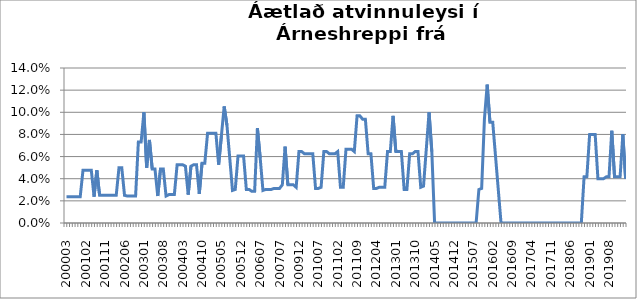
| Category | Series 0 |
|---|---|
| 200003 | 0.024 |
| 200004 | 0.024 |
| 200005 | 0.024 |
| 200010 | 0.024 |
| 200011 | 0.024 |
| 200012 | 0.024 |
| 200101 | 0.048 |
| 200102 | 0.048 |
| 200103 | 0.048 |
| 200104 | 0.048 |
| 200105 | 0.024 |
| 200106 | 0.048 |
| 200107 | 0.025 |
| 200108 | 0.025 |
| 200111 | 0.025 |
| 200112 | 0.025 |
| 200201 | 0.025 |
| 200202 | 0.025 |
| 200203 | 0.025 |
| 200204 | 0.05 |
| 200205 | 0.05 |
| 200206 | 0.025 |
| 200207 | 0.024 |
| 200208 | 0.024 |
| 200209 | 0.024 |
| 200210 | 0.024 |
| 200211 | 0.073 |
| 200212 | 0.073 |
| 200301 | 0.1 |
| 200302 | 0.05 |
| 200303 | 0.075 |
| 200304 | 0.049 |
| 200305 | 0.049 |
| 200306 | 0.024 |
| 200307 | 0.049 |
| 200308 | 0.049 |
| 200309 | 0.024 |
| 200310 | 0.026 |
| 200311 | 0.026 |
| 200312 | 0.026 |
| 200401 | 0.053 |
| 200402 | 0.053 |
| 200403 | 0.053 |
| 200404 | 0.051 |
| 200405 | 0.026 |
| 200406 | 0.051 |
| 200407 | 0.053 |
| 200408 | 0.053 |
| 200409 | 0.026 |
| 200410 | 0.054 |
| 200411 | 0.054 |
| 200412 | 0.081 |
| 200501 | 0.081 |
| 200502 | 0.081 |
| 200503 | 0.081 |
| 200504 | 0.053 |
| 200505 | 0.079 |
| 200506 | 0.105 |
| 200507 | 0.088 |
| 200508 | 0.059 |
| 200509 | 0.029 |
| 200510 | 0.03 |
| 200511 | 0.061 |
| 200512 | 0.061 |
| 200601 | 0.061 |
| 200602 | 0.03 |
| 200603 | 0.03 |
| 200604 | 0.029 |
| 200605 | 0.029 |
| 200606 | 0.086 |
| 200607 | 0.059 |
| 200608 | 0.029 |
| 200609 | 0.03 |
| 200610 | 0.03 |
| 200702 | 0.03 |
| 200703 | 0.031 |
| 200704 | 0.031 |
| 200707 | 0.031 |
| 200708 | 0.034 |
| 200709 | 0.069 |
| 200710 | 0.034 |
| 200711 | 0.034 |
| 200906 | 0.034 |
| 200911 | 0.032 |
| 200912 | 0.065 |
| 201001 | 0.065 |
| 201002 | 0.062 |
| 201003 | 0.062 |
| 201004 | 0.062 |
| 201005 | 0.062 |
| 201006 | 0.031 |
| 201007 | 0.031 |
| 201008 | 0.032 |
| 201009 | 0.065 |
| 201010 | 0.065 |
| 201011 | 0.062 |
| 201012 | 0.062 |
| 201101 | 0.062 |
| 201102 | 0.065 |
| 201103 | 0.032 |
| 201104 | 0.032 |
| 201105 | 0.067 |
| 201106 | 0.067 |
| 201107 | 0.067 |
| 201108 | 0.065 |
| 201109 | 0.097 |
| 201110 | 0.097 |
| 201111 | 0.094 |
| 201112 | 0.094 |
| 201201 | 0.062 |
| 201202 | 0.062 |
| 201203 | 0.031 |
| 201204 | 0.031 |
| 201205 | 0.032 |
| 201208 | 0.032 |
| 201209 | 0.032 |
| 201210 | 0.065 |
| 201211 | 0.065 |
| 201212 | 0.097 |
| 201301 | 0.065 |
| 201302 | 0.065 |
| 201303 | 0.065 |
| 201304 | 0.03 |
| 201305 | 0.03 |
| 201308 | 0.062 |
| 201309 | 0.062 |
| 201310 | 0.065 |
| 201311 | 0.065 |
| 201312 | 0.032 |
| 201401 | 0.033 |
| 201402 | 0.067 |
| 201403 | 0.1 |
| 201404 | 0.065 |
| 201405 | 0 |
| 201406 | 0 |
| 201407 | 0 |
| 201408 | 0 |
| 201409 | 0 |
| 201410 | 0 |
| 201411 | 0 |
| 201412 | 0 |
| 201501 | 0 |
| 201502 | 0 |
| 201503 | 0 |
| 201504 | 0 |
| 201505 | 0 |
| 201506 | 0 |
| 201507 | 0 |
| 201508 | 0 |
| 201509 | 0.03 |
| 201510 | 0.031 |
| 201511 | 0.094 |
| 201512 | 0.125 |
| 201601 | 0.091 |
| 201602 | 0.091 |
| 201603 | 0.061 |
| 201604 | 0.03 |
| 201605 | 0 |
| 201606 | 0 |
| 201607 | 0 |
| 201608 | 0 |
| 201609 | 0 |
| 201610 | 0 |
| 201611 | 0 |
| 201612 | 0 |
| 201701 | 0 |
| 201702 | 0 |
| 201703 | 0 |
| 201704 | 0 |
| 201705 | 0 |
| 201706 | 0 |
| 201707 | 0 |
| 201708 | 0 |
| 201709 | 0 |
| 201710 | 0 |
| 201711 | 0 |
| 201712 | 0 |
| 201801 | 0 |
| 201802 | 0 |
| 201803 | 0 |
| 201804 | 0 |
| 201805 | 0 |
| 201806 | 0 |
| 201807 | 0 |
| 201808 | 0 |
| 201809 | 0 |
| 201810 | 0 |
| 201811 | 0.042 |
| 201812 | 0.042 |
| 201901 | 0.08 |
| 201902 | 0.08 |
| 201903 | 0.08 |
| 201904 | 0.04 |
| 201905 | 0.04 |
| 201906 | 0.04 |
| 201907 | 0.042 |
| 201908 | 0.042 |
| 201909 | 0.083 |
| 201910 | 0.042 |
| 201911 | 0.042 |
| 201912 | 0.042 |
| 202001 | 0.08 |
| 202002 | 0.04 |